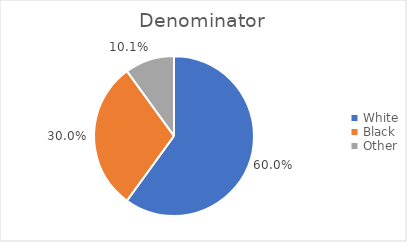
| Category |  Denominator  |
|---|---|
| White | 300 |
| Black | 150 |
| Other | 50 |